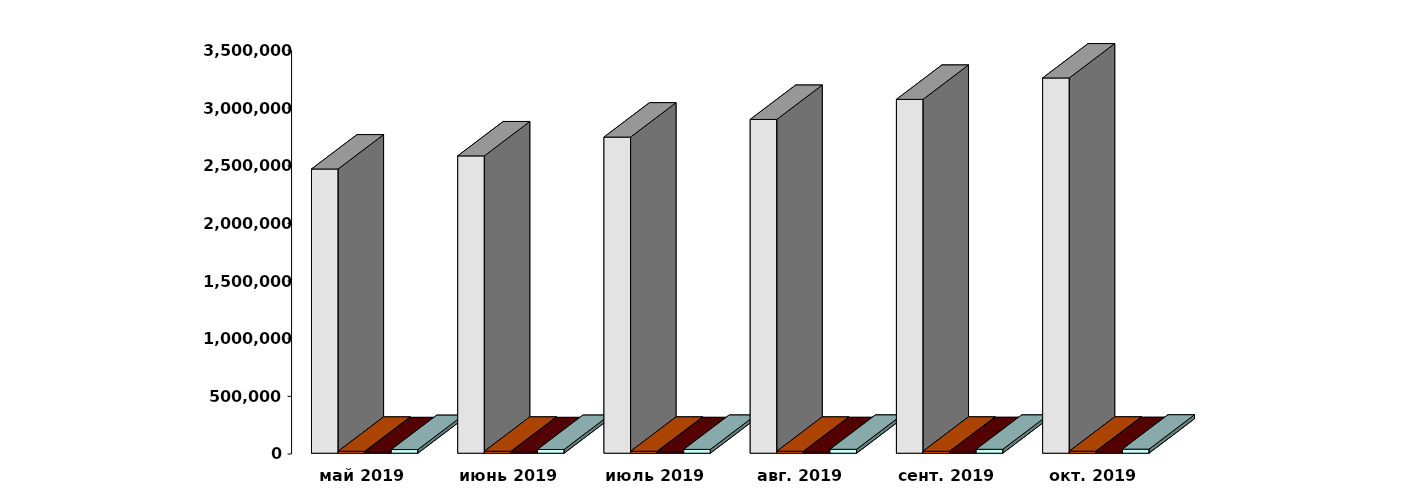
| Category | Физические лица | Юридические лица | Иностранные лица | Клиенты, передавшие свои средства в ДУ |
|---|---|---|---|---|
| 2019-05-30 | 2464521 | 16758 | 12375 | 31803 |
| 2019-06-30 | 2578398 | 16818 | 12464 | 32273 |
| 2019-07-30 | 2741361 | 16917 | 12726 | 33008 |
| 2019-08-30 | 2894450 | 17007 | 12945 | 33858 |
| 2019-09-30 | 3068547 | 17183 | 13213 | 33842 |
| 2019-10-31 | 3253953 | 17389 | 13455 | 35116 |